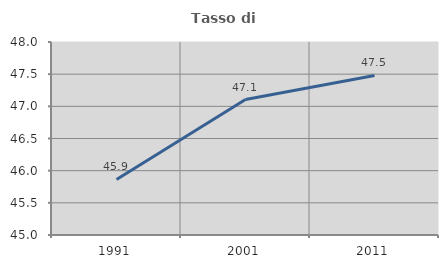
| Category | Tasso di occupazione   |
|---|---|
| 1991.0 | 45.864 |
| 2001.0 | 47.105 |
| 2011.0 | 47.48 |